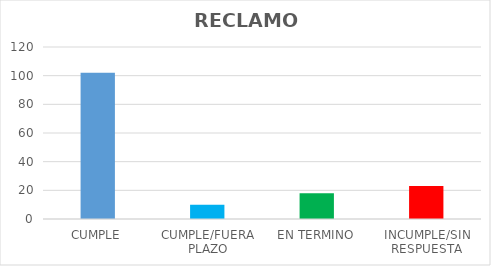
| Category | TOTAL |
|---|---|
| CUMPLE | 102 |
| CUMPLE/FUERA PLAZO | 10 |
| EN TERMINO | 18 |
| INCUMPLE/SIN RESPUESTA | 23 |